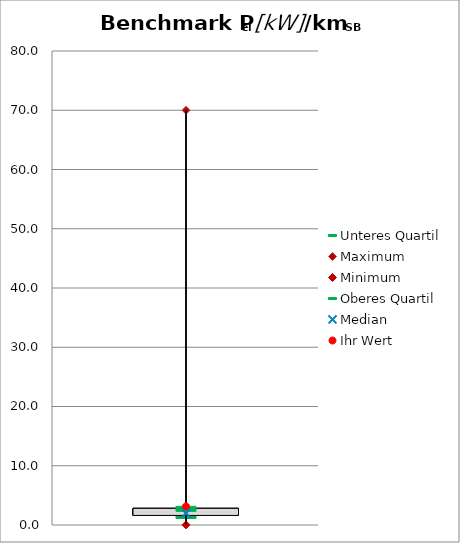
| Category | Unteres Quartil | Maximum | Minimum | Oberes Quartil |
|---|---|---|---|---|
| Pel [kW]/kmSB | 1.615 | 70 | 0.022 | 2.81 |